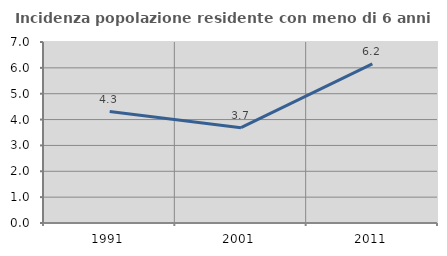
| Category | Incidenza popolazione residente con meno di 6 anni |
|---|---|
| 1991.0 | 4.309 |
| 2001.0 | 3.688 |
| 2011.0 | 6.154 |